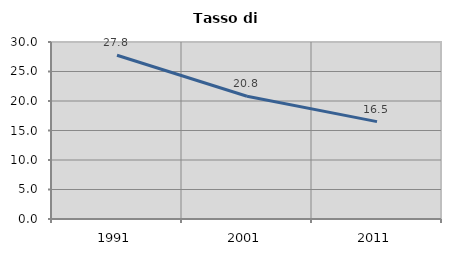
| Category | Tasso di disoccupazione   |
|---|---|
| 1991.0 | 27.751 |
| 2001.0 | 20.812 |
| 2011.0 | 16.508 |